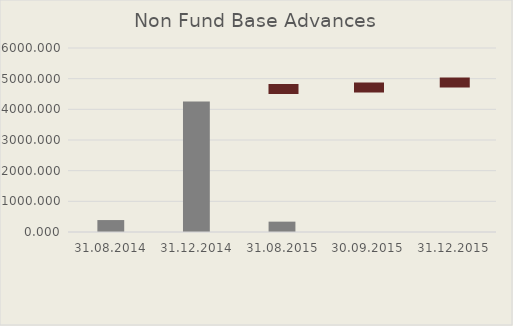
| Category | Non Fund Base Advances |
|---|---|
| 31.08.2014 | 389.194 |
| 31.12.2014 | 4252.174 |
| 31.08.2015 | 337.641 |
| 30.09.2015 | 0 |
| 31.12.2015 | 0 |